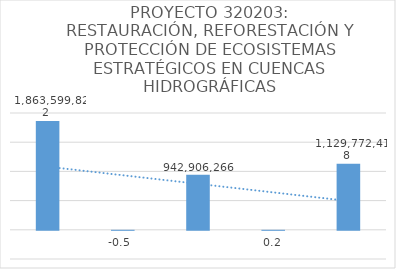
| Category | Series 0 |
|---|---|
| 0 | 1863599822 |
| 1 | -0.494 |
| 2 | 942906266 |
| 3 | 0.198 |
| 4 | 1129772418 |